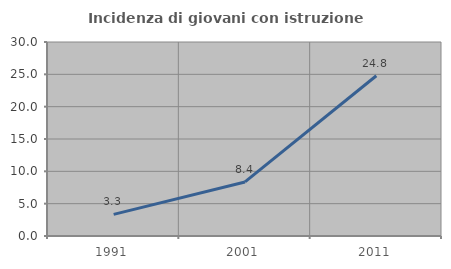
| Category | Incidenza di giovani con istruzione universitaria |
|---|---|
| 1991.0 | 3.347 |
| 2001.0 | 8.362 |
| 2011.0 | 24.786 |